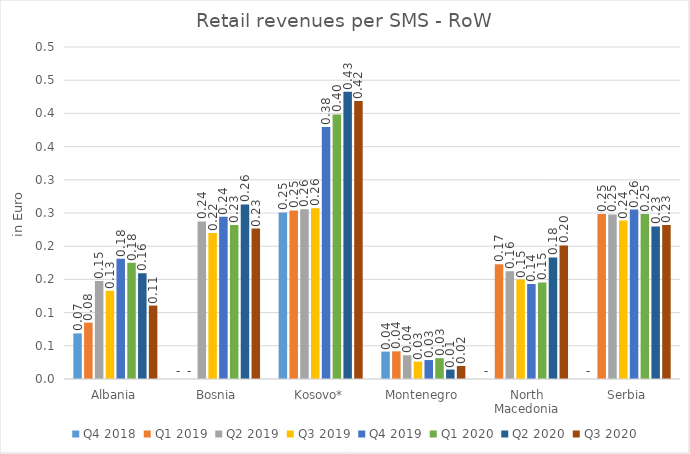
| Category | Q4 2018 | Q1 2019 | Q2 2019 | Q3 2019 | Q4 2019 | Q1 2020 | Q2 2020 | Q3 2020 |
|---|---|---|---|---|---|---|---|---|
| Albania | 0.069 | 0.085 | 0.148 | 0.133 | 0.181 | 0.175 | 0.159 | 0.111 |
| Bosnia | 0 | 0 | 0.237 | 0.22 | 0.244 | 0.232 | 0.263 | 0.227 |
| Kosovo* | 0.251 | 0.254 | 0.256 | 0.257 | 0.379 | 0.398 | 0.433 | 0.419 |
| Montenegro | 0.041 | 0.042 | 0.036 | 0.026 | 0.029 | 0.031 | 0.014 | 0.02 |
| North Macedonia | 0 | 0.173 | 0.162 | 0.15 | 0.143 | 0.145 | 0.183 | 0.201 |
| Serbia | 0 | 0.249 | 0.248 | 0.239 | 0.255 | 0.248 | 0.23 | 0.232 |